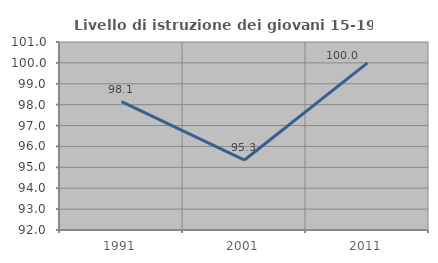
| Category | Livello di istruzione dei giovani 15-19 anni |
|---|---|
| 1991.0 | 98.148 |
| 2001.0 | 95.349 |
| 2011.0 | 100 |